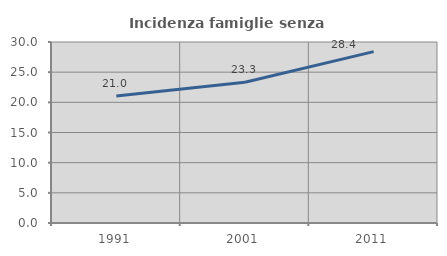
| Category | Incidenza famiglie senza nuclei |
|---|---|
| 1991.0 | 21.034 |
| 2001.0 | 23.327 |
| 2011.0 | 28.405 |